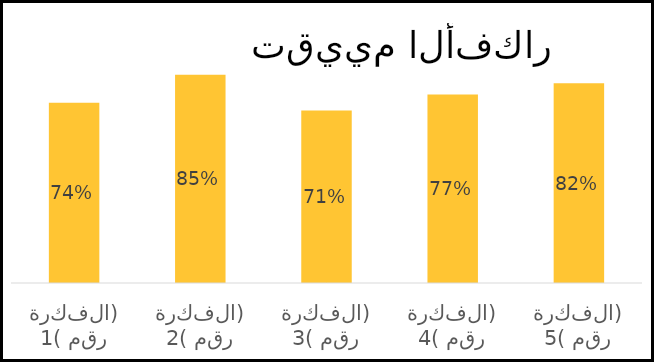
| Category | Series 6 |
|---|---|
| الفكرة رقم (1) | 0.737 |
| الفكرة رقم (2) | 0.851 |
| الفكرة رقم (3) | 0.706 |
| الفكرة رقم (4) | 0.771 |
| الفكرة رقم (5) | 0.817 |